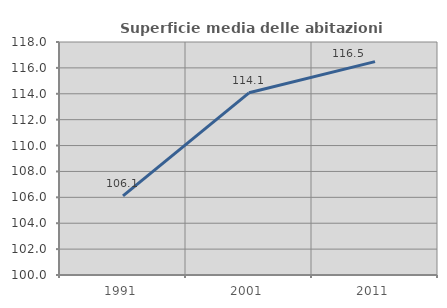
| Category | Superficie media delle abitazioni occupate |
|---|---|
| 1991.0 | 106.116 |
| 2001.0 | 114.075 |
| 2011.0 | 116.484 |